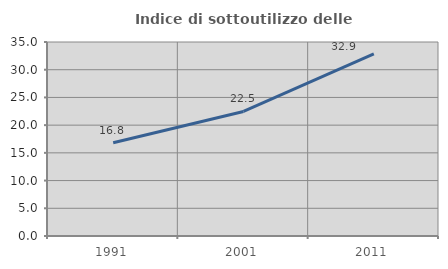
| Category | Indice di sottoutilizzo delle abitazioni  |
|---|---|
| 1991.0 | 16.812 |
| 2001.0 | 22.467 |
| 2011.0 | 32.862 |